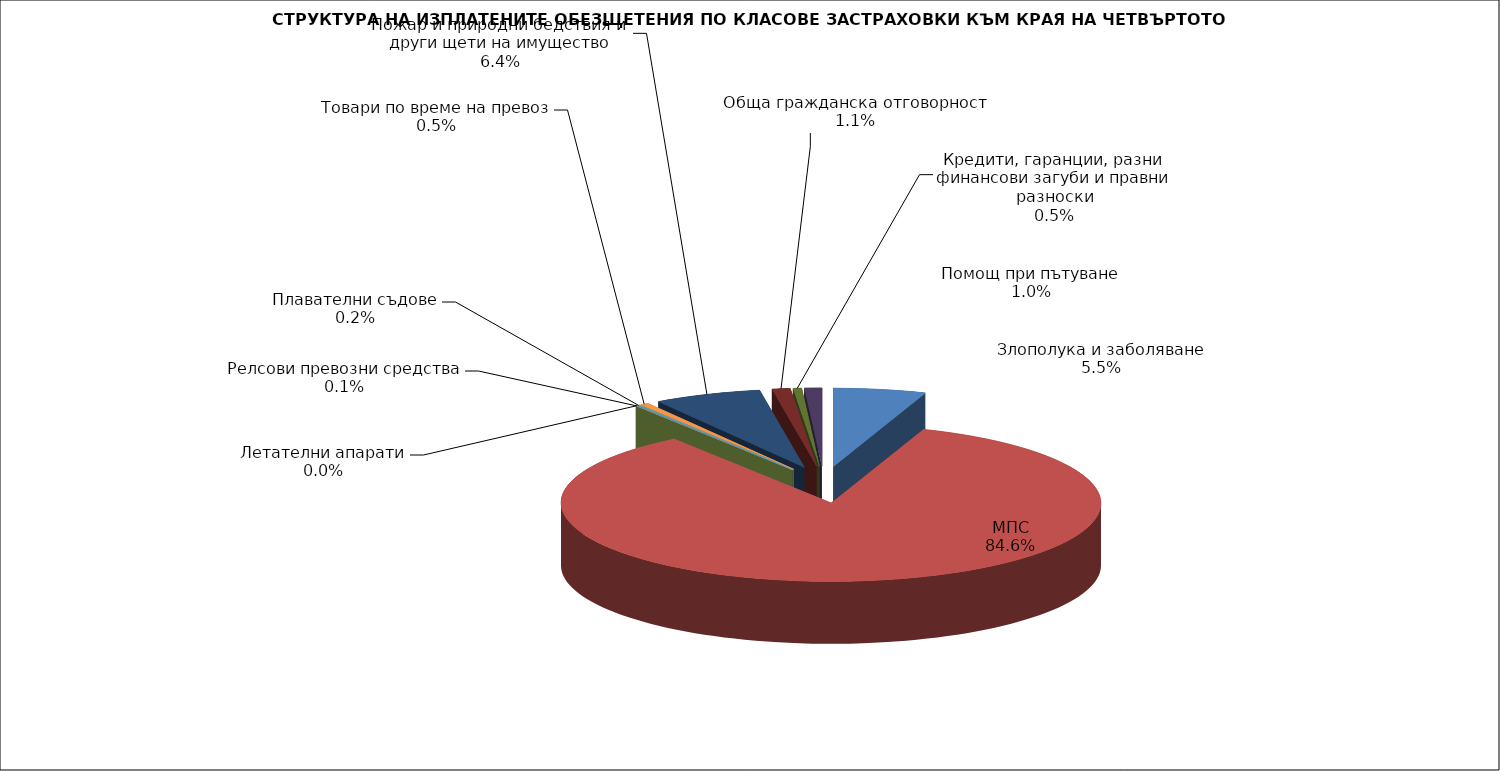
| Category | Злополука и заболяване |
|---|---|
| Злополука и заболяване | 0.055 |
| МПС | 0.846 |
| Релсови превозни средства | 0.001 |
| Летателни апарати | 0 |
| Плавателни съдове | 0.002 |
| Товари по време на превоз | 0.005 |
| Пожар и природни бедствия и други щети на имущество | 0.064 |
| Обща гражданска отговорност | 0.011 |
| Кредити, гаранции, разни финансови загуби и правни разноски | 0.005 |
| Помощ при пътуване | 0.01 |